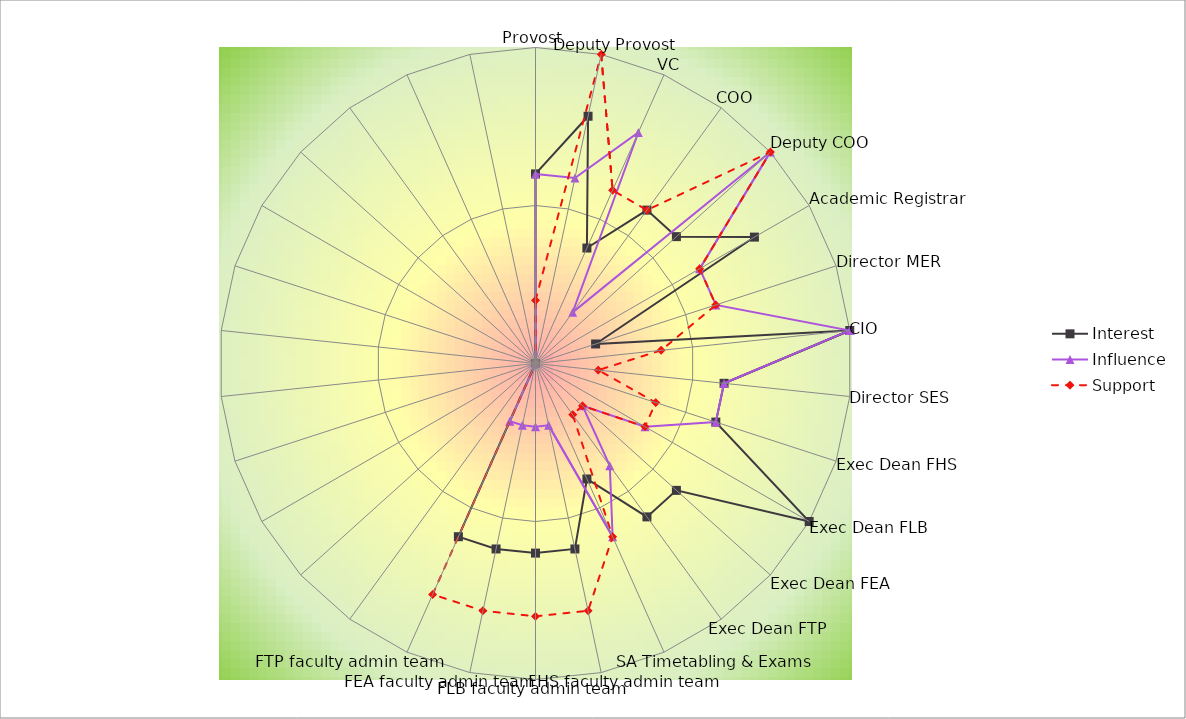
| Category | Interest | Influence | Support |
|---|---|---|---|
| Provost | 3 | 3 | 1 |
| Deputy Provost | 4 | 3 | 5 |
| VC | 2 | 4 | 3 |
| COO | 3 | 1 | 3 |
| Deputy COO | 3 | 5 | 5 |
| Academic Registrar | 4 | 3 | 3 |
| Director MER | 1 | 3 | 3 |
| CIO | 5 | 5 | 2 |
| Director SES | 3 | 3 | 1 |
| Exec Dean FHS | 3 | 3 | 2 |
| Exec Dean FLB | 5 | 2 | 2 |
| Exec Dean FEA | 3 | 1 | 1 |
| Exec Dean FTP | 3 | 2 | 1 |
| SA Timetabling & Exams | 2 | 3 | 3 |
| FHS faculty admin team | 3 | 1 | 4 |
| FLB faculty admin team | 3 | 1 | 4 |
| FEA faculty admin team | 3 | 1 | 4 |
| FTP faculty admin team | 3 | 1 | 4 |